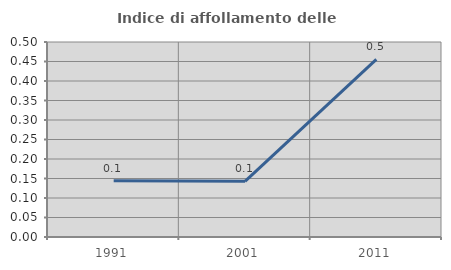
| Category | Indice di affollamento delle abitazioni  |
|---|---|
| 1991.0 | 0.144 |
| 2001.0 | 0.143 |
| 2011.0 | 0.455 |